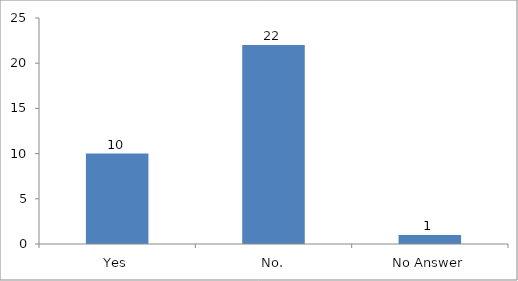
| Category | Have you attended any session on Youth-led Changemaking before? |
|---|---|
| Yes | 10 |
| No. | 22 |
| No Answer | 1 |